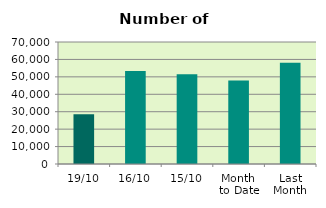
| Category | Series 0 |
|---|---|
| 19/10 | 28552 |
| 16/10 | 53336 |
| 15/10 | 51516 |
| Month 
to Date | 47855.538 |
| Last
Month | 58072.091 |